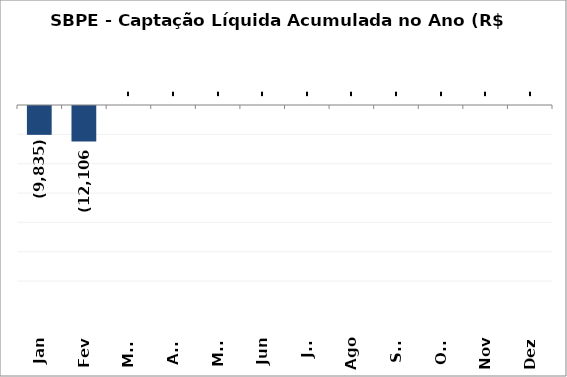
| Category | SBPE - Captação Líquida Acumulada no Ano (R$ Milhões) 2020 |
|---|---|
| Jan | -9835.145 |
| Fev | -12105.725 |
| Mar | 0 |
| Abr | 0 |
| Mai | 0 |
| Jun | 0 |
| Jul | 0 |
| Ago | 0 |
| Set | 0 |
| Out | 0 |
| Nov | 0 |
| Dez | 0 |